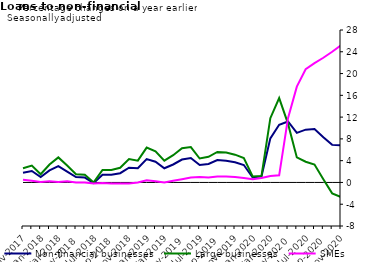
| Category | zero | Non-financial businesses | Large businesses | SMEs |
|---|---|---|---|---|
| Nov-2017 | 0 | 1.8 | 2.6 | 0.5 |
| Dec-2017 | 0 | 2.1 | 3.1 | 0.3 |
| Jan-2018 | 0 | 1 | 1.5 | 0.1 |
| Feb-2018 | 0 | 2.2 | 3.3 | 0.2 |
| Mar-2018 | 0 | 3 | 4.6 | 0.1 |
| Apr-2018 | 0 | 2 | 3.1 | 0.2 |
| May-2018 | 0 | 1 | 1.5 | 0 |
| Jun-2018 | 0 | 0.9 | 1.4 | 0 |
| Jul-2018 | 0 | -0.1 | 0 | -0.2 |
| Aug-2018 | 0 | 1.4 | 2.3 | -0.1 |
| Sep-2018 | 0 | 1.4 | 2.3 | -0.2 |
| Oct-2018 | 0 | 1.7 | 2.7 | -0.2 |
| Nov-2018 | 0 | 2.7 | 4.3 | -0.2 |
| Dec-2018 | 0 | 2.6 | 4 | 0 |
| Jan-2019 | 0 | 4.3 | 6.4 | 0.4 |
| Feb-2019 | 0 | 3.8 | 5.7 | 0.2 |
| Mar-2019 | 0 | 2.6 | 4 | 0 |
| Apr-2019 | 0 | 3.3 | 5 | 0.3 |
| May-2019 | 0 | 4.2 | 6.3 | 0.6 |
| Jun-2019 | 0 | 4.5 | 6.5 | 0.9 |
| Jul-2019 | 0 | 3.2 | 4.4 | 1 |
| Aug-2019 | 0 | 3.4 | 4.7 | 0.9 |
| Sep-2019 | 0 | 4.1 | 5.6 | 1.1 |
| Oct-2019 | 0 | 4 | 5.5 | 1.1 |
| Nov-2019 | 0 | 3.7 | 5.1 | 1 |
| Dec-2019 | 0 | 3.2 | 4.5 | 0.8 |
| Jan-2020 | 0 | 0.9 | 1.1 | 0.6 |
| Feb-2020 | 0 | 1.1 | 1.2 | 0.8 |
| Mar-2020 | 0 | 8.1 | 11.8 | 1.2 |
| Apr-2020 | 0 | 10.6 | 15.5 | 1.3 |
| May-2020 | 0 | 11.2 | 10.8 | 11.8 |
| Jun-2020 | 0 | 9.1 | 4.6 | 17.6 |
| Jul-2020 | 0 | 9.7 | 3.8 | 20.8 |
| Aug-2020 | 0 | 9.8 | 3.3 | 21.9 |
| Sep-2020 | 0 | 8.3 | 0.6 | 22.9 |
| Oct-2020 | 0 | 6.9 | -2 | 24 |
| Nov-2020 | 0 | 6.8 | -2.7 | 25.2 |